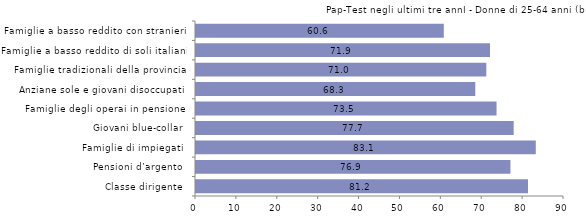
| Category | Pap Test |
|---|---|
| Classe dirigente  | 81.2 |
| Pensioni d’argento  | 76.9 |
| Famiglie di impiegati  | 83.1 |
| Giovani blue-collar  | 77.7 |
| Famiglie degli operai in pensione  | 73.5 |
| Anziane sole e giovani disoccupati  | 68.3 |
| Famiglie tradizionali della provincia  | 71 |
| Famiglie a basso reddito di soli italiani  | 71.9 |
| Famiglie a basso reddito con stranieri  | 60.6 |